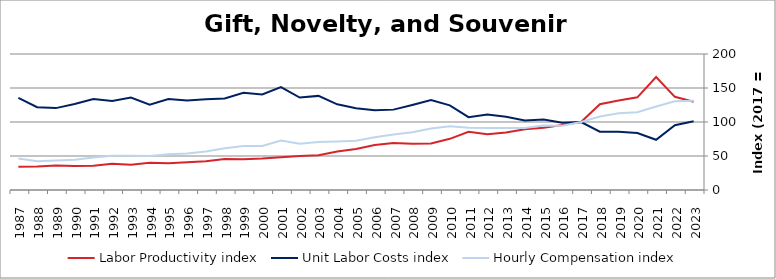
| Category | Labor Productivity index | Unit Labor Costs index | Hourly Compensation index |
|---|---|---|---|
| 2023.0 | 129.848 | 101.052 | 131.213 |
| 2022.0 | 137.019 | 95.3 | 130.58 |
| 2021.0 | 166.224 | 73.841 | 122.741 |
| 2020.0 | 136.283 | 83.896 | 114.336 |
| 2019.0 | 131.521 | 85.764 | 112.798 |
| 2018.0 | 126.127 | 85.662 | 108.043 |
| 2017.0 | 100 | 100 | 100 |
| 2016.0 | 95.467 | 98.895 | 94.413 |
| 2015.0 | 91.502 | 103.829 | 95.005 |
| 2014.0 | 89.359 | 102.091 | 91.228 |
| 2013.0 | 84.581 | 107.671 | 91.069 |
| 2012.0 | 82.145 | 110.971 | 91.158 |
| 2011.0 | 85.568 | 107.048 | 91.599 |
| 2010.0 | 75.236 | 124.557 | 93.712 |
| 2009.0 | 68.289 | 132.307 | 90.352 |
| 2008.0 | 67.904 | 125.019 | 84.893 |
| 2007.0 | 69.002 | 118.196 | 81.558 |
| 2006.0 | 66.024 | 117.416 | 77.523 |
| 2005.0 | 60.254 | 120.35 | 72.516 |
| 2004.0 | 56.725 | 126.017 | 71.484 |
| 2003.0 | 50.999 | 138.392 | 70.578 |
| 2002.0 | 50.116 | 135.928 | 68.122 |
| 2001.0 | 48.154 | 151.395 | 72.903 |
| 2000.0 | 46.156 | 140.548 | 64.871 |
| 1999.0 | 45.377 | 142.826 | 64.81 |
| 1998.0 | 45.729 | 134.511 | 61.51 |
| 1997.0 | 42.431 | 133.445 | 56.622 |
| 1996.0 | 40.631 | 131.754 | 53.533 |
| 1995.0 | 39.198 | 133.846 | 52.465 |
| 1994.0 | 39.961 | 125.401 | 50.112 |
| 1993.0 | 37.206 | 135.846 | 50.543 |
| 1992.0 | 38.509 | 130.77 | 50.358 |
| 1991.0 | 35.779 | 133.788 | 47.868 |
| 1990.0 | 35.123 | 126.345 | 44.376 |
| 1989.0 | 36.124 | 120.424 | 43.502 |
| 1988.0 | 34.6 | 121.721 | 42.116 |
| 1987.0 | 34.169 | 135.467 | 46.288 |